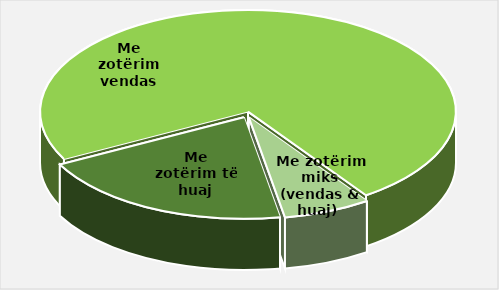
| Category | Të ardhura 2022 (në lekë) |
|---|---|
| Me zotërim të huaj | 249458175947 |
| Me zotërim vendas | 909111175453.338 |
| Me zotërim miks (vendas & huaj)  | 84863254087 |